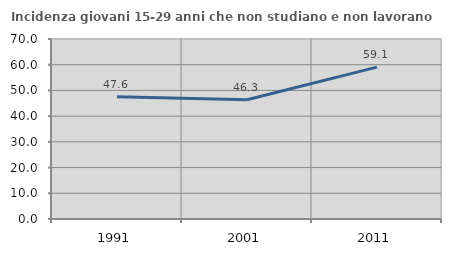
| Category | Incidenza giovani 15-29 anni che non studiano e non lavorano  |
|---|---|
| 1991.0 | 47.569 |
| 2001.0 | 46.348 |
| 2011.0 | 59.058 |